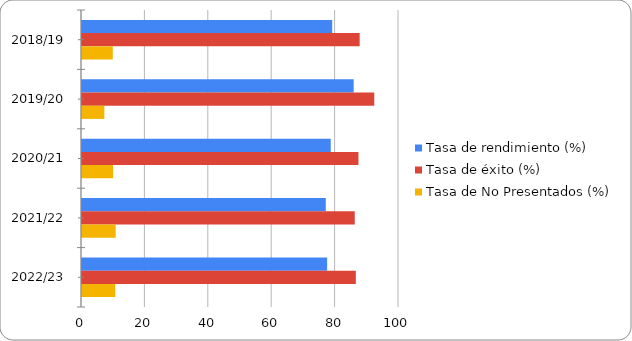
| Category | Tasa de rendimiento (%) | Tasa de éxito (%) | Tasa de No Presentados (%) |
|---|---|---|---|
| 2018/19 | 78.93 | 87.59 | 9.71 |
| 2019/20 | 85.7 | 92.19 | 7.05 |
| 2020/21 | 78.47 | 87.21 | 9.81 |
| 2021/22 | 76.9 | 86.04 | 10.62 |
| 2022/23 | 77.33 | 86.38 | 10.48 |